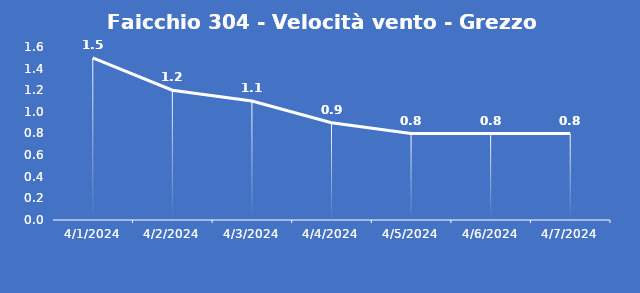
| Category | Faicchio 304 - Velocità vento - Grezzo (m/s) |
|---|---|
| 4/1/24 | 1.5 |
| 4/2/24 | 1.2 |
| 4/3/24 | 1.1 |
| 4/4/24 | 0.9 |
| 4/5/24 | 0.8 |
| 4/6/24 | 0.8 |
| 4/7/24 | 0.8 |